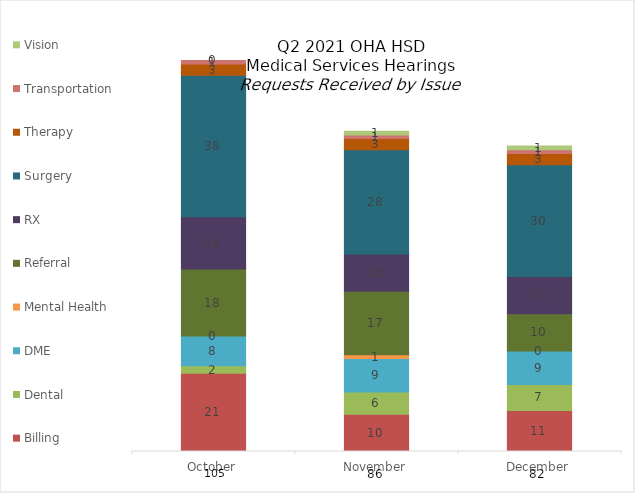
| Category | Billing | Dental | DME | Mental Health | Referral | RX | Surgery | Therapy | Transportation | Vision |
|---|---|---|---|---|---|---|---|---|---|---|
| October | 21 | 2 | 8 | 0 | 18 | 14 | 38 | 3 | 1 | 0 |
| November | 10 | 6 | 9 | 1 | 17 | 10 | 28 | 3 | 1 | 1 |
| December | 11 | 7 | 9 | 0 | 10 | 10 | 30 | 3 | 1 | 1 |